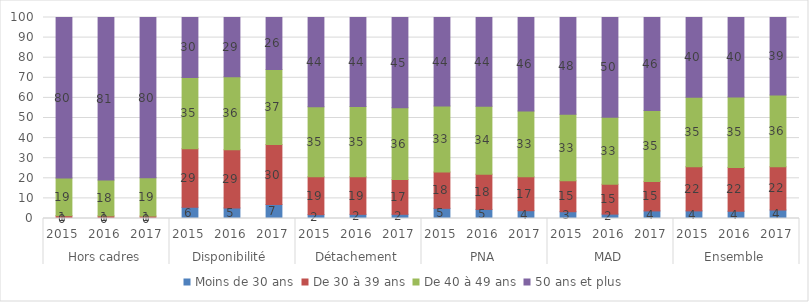
| Category | Moins de 30 ans | De 30 à 39 ans | De 40 à 49 ans | 50 ans et plus |
|---|---|---|---|---|
| 0 | 0 | 1.408 | 18.732 | 79.859 |
| 1 | 0 | 1.297 | 17.828 | 80.875 |
| 2 | 0 | 1.207 | 19.115 | 79.678 |
| 3 | 5.568 | 29.183 | 35.437 | 29.811 |
| 4 | 5.228 | 28.916 | 36.379 | 29.477 |
| 5 | 6.993 | 29.772 | 37.382 | 25.852 |
| 6 | 1.922 | 18.843 | 34.822 | 44.413 |
| 7 | 2.065 | 18.736 | 34.95 | 44.249 |
| 8 | 2.087 | 17.258 | 35.78 | 44.875 |
| 9 | 5.058 | 18.078 | 32.859 | 44.005 |
| 10 | 4.518 | 17.543 | 33.811 | 44.128 |
| 11 | 3.877 | 16.847 | 32.782 | 46.494 |
| 12 | 3.366 | 15.393 | 33.055 | 48.187 |
| 13 | 2.178 | 14.847 | 33.333 | 49.642 |
| 14 | 3.768 | 14.7 | 35.238 | 46.294 |
| 15 | 3.785 | 22.004 | 34.502 | 39.71 |
| 16 | 3.608 | 21.809 | 35.077 | 39.505 |
| 17 | 4.225 | 21.508 | 35.694 | 38.573 |